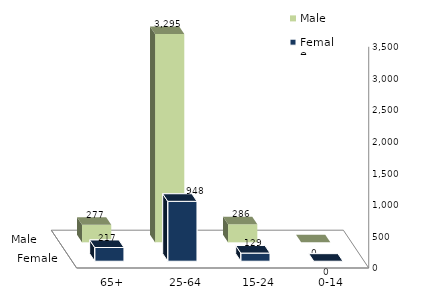
| Category | Male | Female |
|---|---|---|
| 0-14 | 0 | 0 |
| 15-24 | 286 | 129 |
| 25-64 | 3295 | 948 |
| 65+ | 277 | 217 |